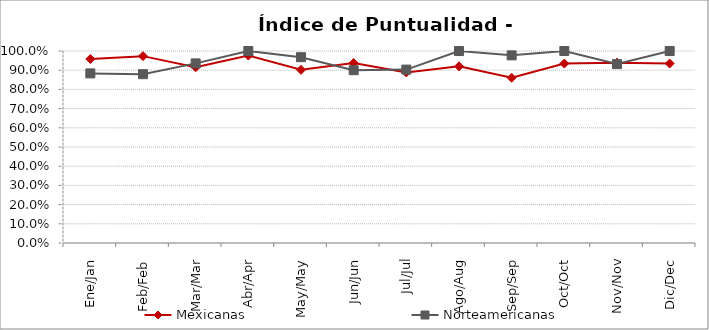
| Category | Mexicanas | Norteamericanas |
|---|---|---|
| Ene/Jan | 0.958 | 0.883 |
| Feb/Feb | 0.973 | 0.879 |
| Mar/Mar | 0.915 | 0.935 |
| Abr/Apr | 0.976 | 1 |
| May/May | 0.902 | 0.968 |
| Jun/Jun | 0.938 | 0.9 |
| Jul/Jul | 0.888 | 0.903 |
| Ago/Aug | 0.92 | 1 |
| Sep/Sep | 0.861 | 0.977 |
| Oct/Oct | 0.935 | 1 |
| Nov/Nov | 0.939 | 0.932 |
| Dic/Dec | 0.935 | 1 |